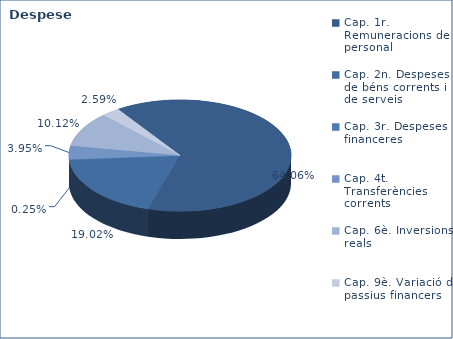
| Category | Series 0 |
|---|---|
| Cap. 1r. Remuneracions de personal | 194672923 |
| Cap. 2n. Despeses de béns corrents i de serveis | 57787860 |
| Cap. 3r. Despeses financeres | 771735 |
| Cap. 4t. Transferències corrents | 12015430 |
| Cap. 6è. Inversions reals | 30765787 |
| Cap. 9è. Variació de passius financers | 7878612 |